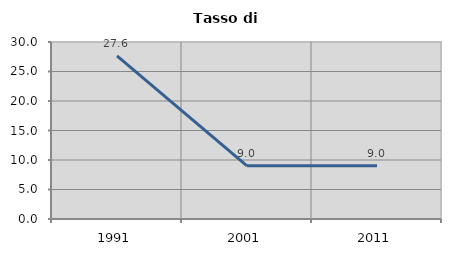
| Category | Tasso di disoccupazione   |
|---|---|
| 1991.0 | 27.632 |
| 2001.0 | 9.01 |
| 2011.0 | 9.012 |